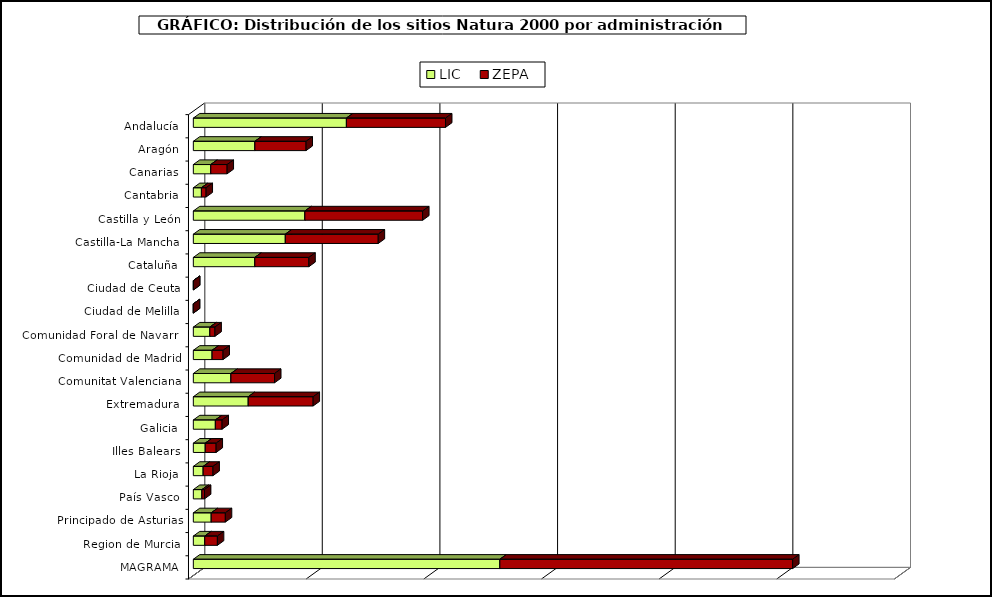
| Category | LIC | ZEPA |
|---|---|---|
| Andalucía | 2602250.766 | 1685038.554 |
| Aragón | 1046501.758 | 869801.449 |
| Canarias | 296607.789 | 277315.594 |
| Cantabria | 137559.256 | 79130.636 |
| Castilla y León | 1896220.388 | 2001839.905 |
| Castilla-La Mancha | 1563873.814 | 1579154.659 |
| Cataluña | 1045133.117 | 918616.583 |
| Ciudad de Ceuta | 1466.731 | 630.322 |
| Ciudad de Melilla | 91.58 | 0 |
| Comunidad Foral de Navarra | 280848.218 | 86327.381 |
| Comunidad de Madrid | 319545.367 | 185404.838 |
| Comunitat Valenciana | 639195.722 | 741612.96 |
| Extremadura | 933772.682 | 1102403.886 |
| Galicia | 374671.733 | 113856.918 |
| Illes Balears | 202816.382 | 184161.852 |
| La Rioja | 167545.787 | 165835.626 |
| País Vasco | 146449.356 | 42060.378 |
| Principado de Asturias | 304372.3 | 239508.01 |
| Region de Murcia | 194438.135 | 214315.41 |
| MAGRAMA | 5211421.45 | 4977014.519 |